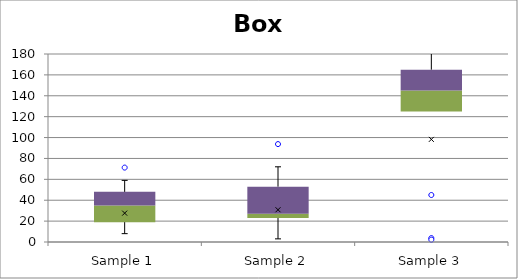
| Category | Min | Q1-Min | Med-Q1 | Q3-Med |
|---|---|---|---|---|
| Sample 1 | 8 | 11 | 16 | 13 |
| Sample 2 | 3 | 20 | 4 | 26 |
| Sample 3 | 125 | 0 | 20 | 20 |